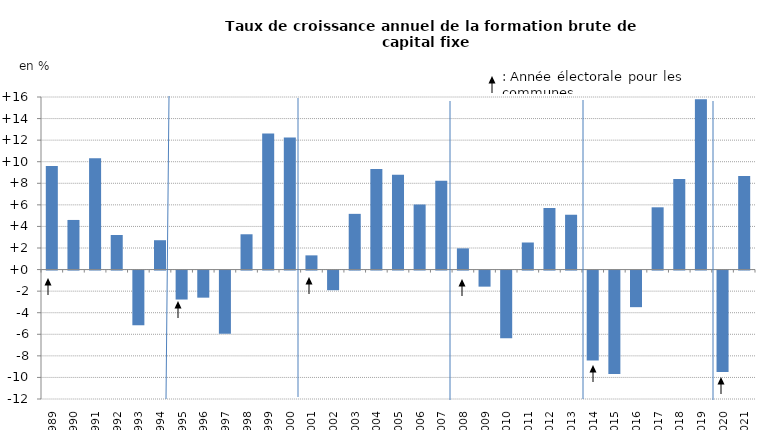
| Category | taux de croissance annuel de la FBCF des APUL |
|---|---|
| 1989.0 | 9.607 |
| 1990.0 | 4.601 |
| 1991.0 | 10.317 |
| 1992.0 | 3.205 |
| 1993.0 | -5.07 |
| 1994.0 | 2.722 |
| 1995.0 | -2.685 |
| 1996.0 | -2.511 |
| 1997.0 | -5.866 |
| 1998.0 | 3.273 |
| 1999.0 | 12.618 |
| 2000.0 | 12.235 |
| 2001.0 | 1.317 |
| 2002.0 | -1.82 |
| 2003.0 | 5.166 |
| 2004.0 | 9.33 |
| 2005.0 | 8.792 |
| 2006.0 | 6.025 |
| 2007.0 | 8.226 |
| 2008.0 | 1.967 |
| 2009.0 | -1.49 |
| 2010.0 | -6.267 |
| 2011.0 | 2.51 |
| 2012.0 | 5.707 |
| 2013.0 | 5.084 |
| 2014.0 | -8.328 |
| 2015.0 | -9.579 |
| 2016.0 | -3.393 |
| 2017.0 | 5.773 |
| 2018.0 | 8.396 |
| 2019.0 | 15.791 |
| 2020.0 | -9.406 |
| 2021.0 | 8.672 |